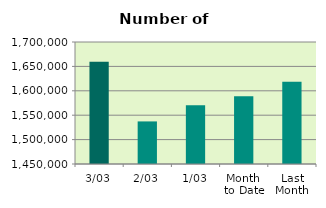
| Category | Series 0 |
|---|---|
| 3/03 | 1659300 |
| 2/03 | 1537258 |
| 1/03 | 1570448 |
| Month 
to Date | 1589002 |
| Last
Month | 1618522.4 |